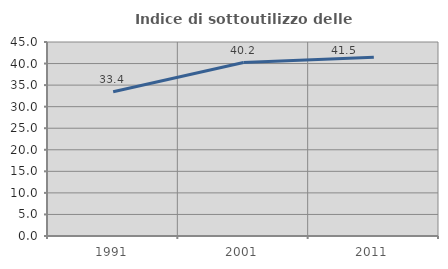
| Category | Indice di sottoutilizzo delle abitazioni  |
|---|---|
| 1991.0 | 33.449 |
| 2001.0 | 40.238 |
| 2011.0 | 41.483 |